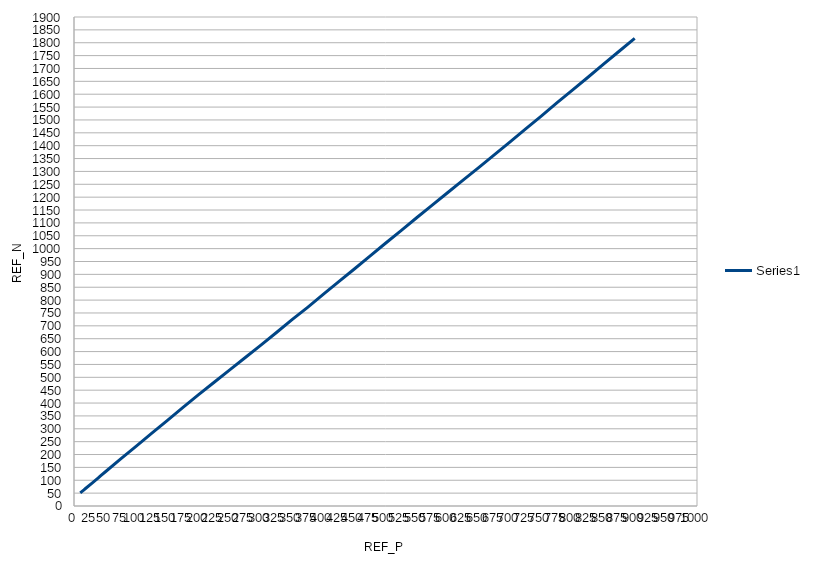
| Category | Series 0 |
|---|---|
| 10.0 | 51 |
| 11.0 | 53 |
| 12.0 | 55 |
| 13.0 | 57 |
| 14.0 | 59 |
| 15.0 | 61 |
| 16.0 | 63 |
| 17.0 | 65 |
| 18.0 | 67 |
| 19.0 | 69 |
| 29.0 | 89 |
| 39.0 | 109 |
| 43.0 | 118 |
| 50.0 | 132 |
| 75.0 | 183 |
| 100.0 | 233 |
| 125.0 | 283 |
| 150.0 | 333 |
| 175.0 | 383 |
| 200.0 | 433 |
| 225.0 | 481 |
| 250.0 | 529 |
| 275.0 | 577 |
| 300.0 | 625 |
| 325.0 | 674 |
| 350.0 | 724 |
| 375.0 | 772 |
| 400.0 | 822 |
| 425.0 | 872 |
| 450.0 | 921 |
| 475.0 | 971 |
| 500.0 | 1021 |
| 525.0 | 1070 |
| 550.0 | 1120 |
| 575.0 | 1169 |
| 600.0 | 1218 |
| 625.0 | 1267 |
| 650.0 | 1316 |
| 675.0 | 1365 |
| 700.0 | 1415 |
| 725.0 | 1465 |
| 750.0 | 1515 |
| 775.0 | 1566 |
| 800.0 | 1616 |
| 825.0 | 1666 |
| 850.0 | 1717 |
| 875.0 | 1767 |
| 900.0 | 1817 |